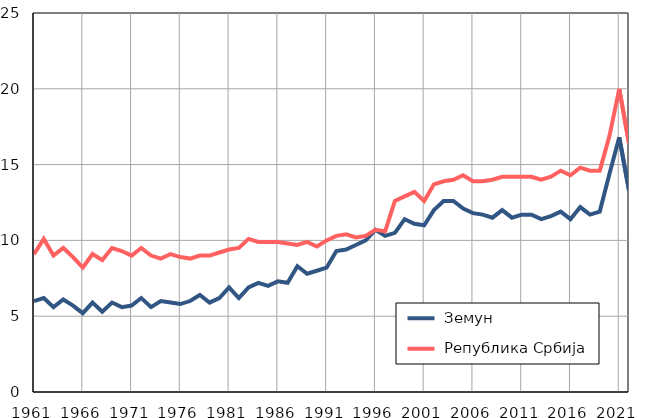
| Category |  Земун |  Република Србија |
|---|---|---|
| 1961.0 | 6 | 9.1 |
| 1962.0 | 6.2 | 10.1 |
| 1963.0 | 5.6 | 9 |
| 1964.0 | 6.1 | 9.5 |
| 1965.0 | 5.7 | 8.9 |
| 1966.0 | 5.2 | 8.2 |
| 1967.0 | 5.9 | 9.1 |
| 1968.0 | 5.3 | 8.7 |
| 1969.0 | 5.9 | 9.5 |
| 1970.0 | 5.6 | 9.3 |
| 1971.0 | 5.7 | 9 |
| 1972.0 | 6.2 | 9.5 |
| 1973.0 | 5.6 | 9 |
| 1974.0 | 6 | 8.8 |
| 1975.0 | 5.9 | 9.1 |
| 1976.0 | 5.8 | 8.9 |
| 1977.0 | 6 | 8.8 |
| 1978.0 | 6.4 | 9 |
| 1979.0 | 5.9 | 9 |
| 1980.0 | 6.2 | 9.2 |
| 1981.0 | 6.9 | 9.4 |
| 1982.0 | 6.2 | 9.5 |
| 1983.0 | 6.9 | 10.1 |
| 1984.0 | 7.2 | 9.9 |
| 1985.0 | 7 | 9.9 |
| 1986.0 | 7.3 | 9.9 |
| 1987.0 | 7.2 | 9.8 |
| 1988.0 | 8.3 | 9.7 |
| 1989.0 | 7.8 | 9.9 |
| 1990.0 | 8 | 9.6 |
| 1991.0 | 8.2 | 10 |
| 1992.0 | 9.3 | 10.3 |
| 1993.0 | 9.4 | 10.4 |
| 1994.0 | 9.7 | 10.2 |
| 1995.0 | 10 | 10.3 |
| 1996.0 | 10.7 | 10.7 |
| 1997.0 | 10.3 | 10.6 |
| 1998.0 | 10.5 | 12.6 |
| 1999.0 | 11.4 | 12.9 |
| 2000.0 | 11.1 | 13.2 |
| 2001.0 | 11 | 12.6 |
| 2002.0 | 12 | 13.7 |
| 2003.0 | 12.6 | 13.9 |
| 2004.0 | 12.6 | 14 |
| 2005.0 | 12.1 | 14.3 |
| 2006.0 | 11.8 | 13.9 |
| 2007.0 | 11.7 | 13.9 |
| 2008.0 | 11.5 | 14 |
| 2009.0 | 12 | 14.2 |
| 2010.0 | 11.5 | 14.2 |
| 2011.0 | 11.7 | 14.2 |
| 2012.0 | 11.7 | 14.2 |
| 2013.0 | 11.4 | 14 |
| 2014.0 | 11.6 | 14.2 |
| 2015.0 | 11.9 | 14.6 |
| 2016.0 | 11.4 | 14.3 |
| 2017.0 | 12.2 | 14.8 |
| 2018.0 | 11.7 | 14.6 |
| 2019.0 | 11.9 | 14.6 |
| 2020.0 | 14.4 | 16.9 |
| 2021.0 | 16.8 | 20 |
| 2022.0 | 13.3 | 16.4 |